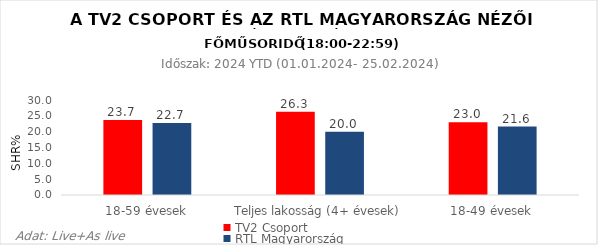
| Category | TV2 Csoport | RTL Magyarország |
|---|---|---|
| 18-59 évesek | 23.7 | 22.7 |
| Teljes lakosság (4+ évesek) | 26.3 | 20 |
| 18-49 évesek | 23 | 21.6 |